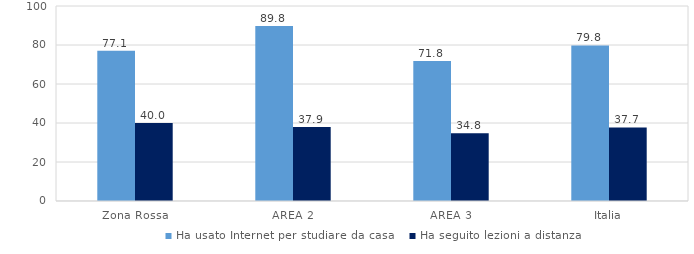
| Category | Ha usato Internet per studiare da casa | Ha seguito lezioni a distanza |
|---|---|---|
| Zona Rossa | 77.1 | 40 |
| AREA 2 | 89.8 | 37.9 |
| AREA 3 | 71.8 | 34.8 |
| Italia | 79.8 | 37.7 |